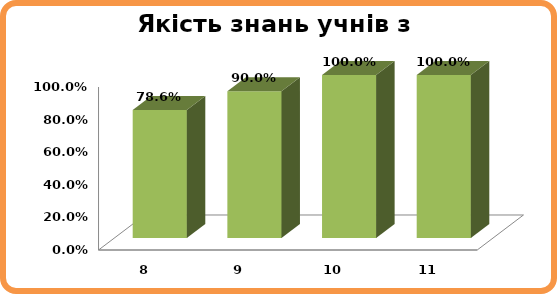
| Category | Series 0 |
|---|---|
| 8.0 | 0.786 |
| 9.0 | 0.9 |
| 10.0 | 1 |
| 11.0 | 1 |